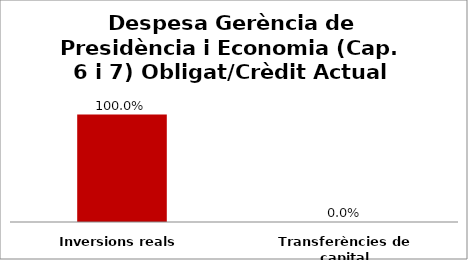
| Category | Series 0 |
|---|---|
| Inversions reals | 1 |
| Transferències de capital | 0 |